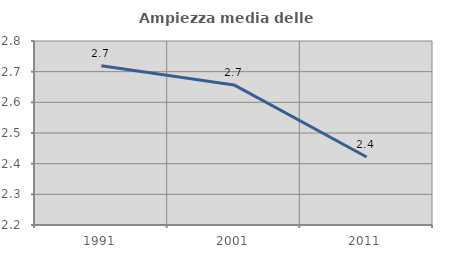
| Category | Ampiezza media delle famiglie |
|---|---|
| 1991.0 | 2.72 |
| 2001.0 | 2.657 |
| 2011.0 | 2.422 |